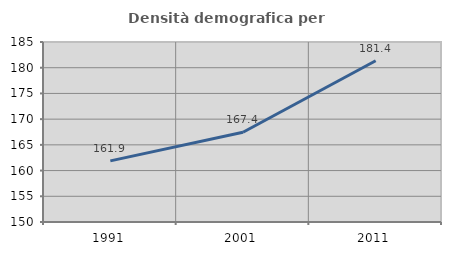
| Category | Densità demografica |
|---|---|
| 1991.0 | 161.881 |
| 2001.0 | 167.446 |
| 2011.0 | 181.358 |